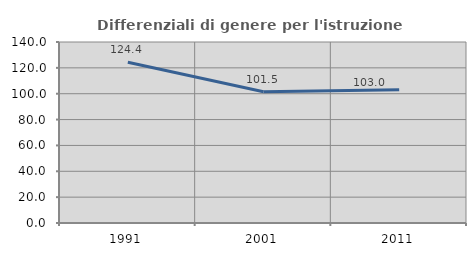
| Category | Differenziali di genere per l'istruzione superiore |
|---|---|
| 1991.0 | 124.353 |
| 2001.0 | 101.524 |
| 2011.0 | 102.975 |